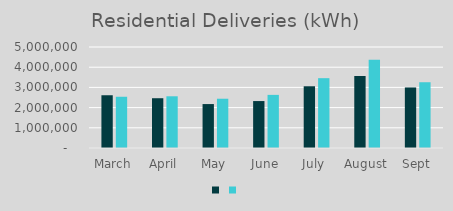
| Category | Series 1 | Series 0 |
|---|---|---|
| March | 2611486 | 2536769 |
| April | 2464085 | 2560197 |
| May | 2175066 | 2439036 |
| June | 2323720 | 2629934 |
| July  | 3056084 | 3456641 |
| August | 3564883 | 4364840 |
| Sept | 2997393 | 3255766 |